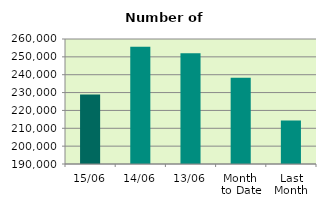
| Category | Series 0 |
|---|---|
| 15/06 | 228966 |
| 14/06 | 255608 |
| 13/06 | 251960 |
| Month 
to Date | 238230.364 |
| Last
Month | 214383.182 |